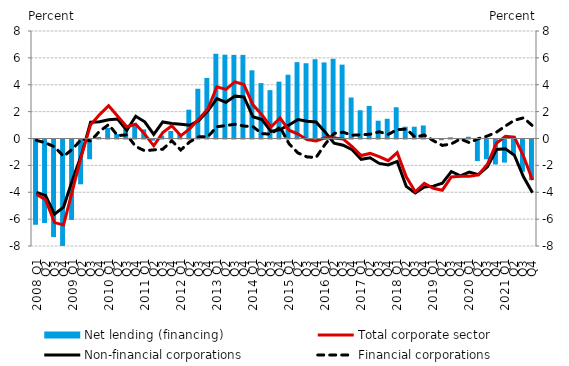
| Category | Net lending (financing) |
|---|---|
| 2008 Q1 | -6.347 |
| Q2 | -6.211 |
| Q3 | -7.262 |
| Q4 | -7.922 |
| 2009 Q1 | -5.987 |
| Q2 | -3.336 |
| Q3 | -1.467 |
| Q4 | 0.114 |
| 2010 Q1 | 0.788 |
| Q2 | 0.342 |
| Q3 | 0.697 |
| Q4 | 1.087 |
| 2011 Q1 | 0.678 |
| Q2 | -0.085 |
| Q3 | 0.221 |
| Q4 | 0.556 |
| 2012 Q1 | 0.346 |
| Q2 | 2.144 |
| Q3 | 3.702 |
| Q4 | 4.508 |
| 2013 Q1 | 6.308 |
| Q2 | 6.238 |
| Q3 | 6.224 |
| Q4 | 6.222 |
| 2014 Q1 | 5.076 |
| Q2 | 4.121 |
| Q3 | 3.597 |
| Q4 | 4.23 |
| 2015 Q1 | 4.745 |
| Q2 | 5.68 |
| Q3 | 5.601 |
| Q4 | 5.899 |
| 2016 Q1 | 5.663 |
| Q2 | 5.928 |
| Q3 | 5.497 |
| Q4 | 3.052 |
| 2017 Q1 | 2.102 |
| Q2 | 2.426 |
| Q3 | 1.324 |
| Q4 | 1.469 |
| 2018 Q1 | 2.325 |
| Q2 | 0.878 |
| Q3 | 0.876 |
| Q4 | 0.969 |
| 2019 Q1 | -0.002 |
| Q2 | -0.049 |
| Q3 | 0.088 |
| Q4 | 0.005 |
| 2020 Q1 | 0.131 |
| Q2 | -1.606 |
| Q3 | -1.47 |
| Q4 | -1.857 |
|  2021 Q1 | -1.719 |
| Q2 | -1.158 |
| Q3 | -2.399 |
| Q4 | -3.024 |